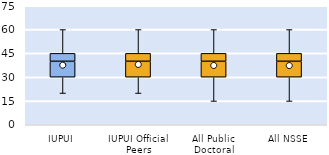
| Category | 25th | 50th | 75th |
|---|---|---|---|
| IUPUI | 30 | 10 | 5 |
| IUPUI Official Peers | 30 | 10 | 5 |
| All Public Doctoral | 30 | 10 | 5 |
| All NSSE | 30 | 10 | 5 |